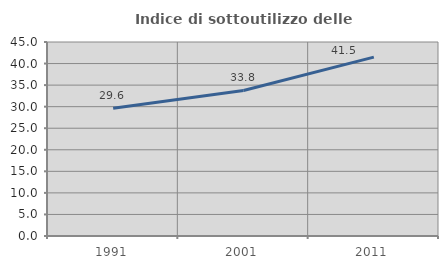
| Category | Indice di sottoutilizzo delle abitazioni  |
|---|---|
| 1991.0 | 29.633 |
| 2001.0 | 33.766 |
| 2011.0 | 41.492 |